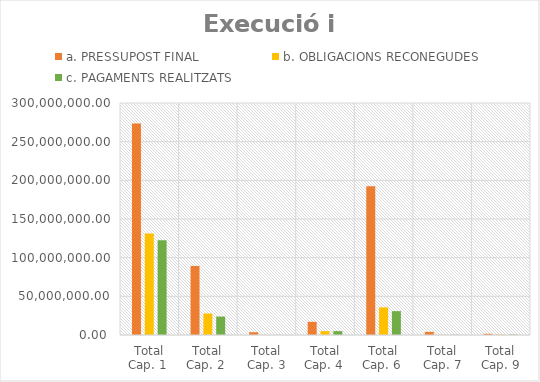
| Category | a. PRESSUPOST FINAL | b. OBLIGACIONS RECONEGUDES | c. PAGAMENTS REALITZATS |
|---|---|---|---|
| Total Cap. 1  | 273610544.46 | 131089863.57 | 122532044.69 |
| Total Cap. 2  | 89298253.5 | 27750811.31 | 23835540.56 |
| Total Cap. 3 | 3598122.36 | 77826.8 | 77826.8 |
| Total Cap. 4  | 17001451.29 | 5037980.54 | 5028101.09 |
| Total Cap. 6  | 192354174.54 | 35741183.72 | 30849865.95 |
| Total Cap. 7 | 4028761.29 | 265775.3 | 265775.3 |
| Total Cap. 9 | 1565346.68 | 577280.45 | 577280.45 |